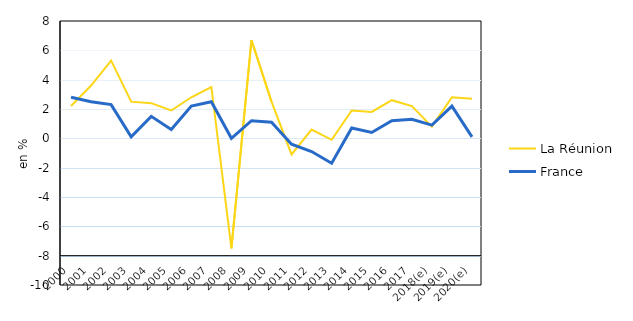
| Category | La Réunion | France |
|---|---|---|
| 2000 | 2.2 | 2.8 |
| 2001 | 3.6 | 2.5 |
| 2002 | 5.3 | 2.3 |
| 2003 | 2.5 | 0.1 |
| 2004 | 2.4 | 1.5 |
| 2005 | 1.9 | 0.6 |
| 2006 | 2.8 | 2.2 |
| 2007 | 3.5 | 2.5 |
| 2008 | -7.5 | 0 |
| 2009 | 6.7 | 1.2 |
| 2010 | 2.5 | 1.1 |
| 2011 | -1.1 | -0.4 |
| 2012 | 0.6 | -0.9 |
| 2013 | -0.1 | -1.7 |
| 2014 | 1.9 | 0.7 |
| 2015 | 1.8 | 0.4 |
| 2016 | 2.6 | 1.2 |
| 2017 | 2.2 | 1.3 |
| 2018(e) | 0.8 | 0.9 |
| 2019(e) | 2.8 | 2.2 |
| 2020(e) | 2.7 | 0.1 |